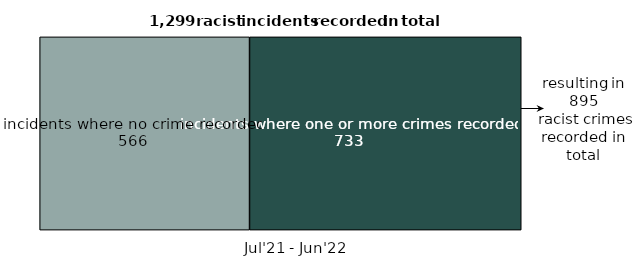
| Category | incidents where one or more crimes recorded | incidents where no crime recorded |
|---|---|---|
| Jul'21-Jun'22 | 733 | 566 |